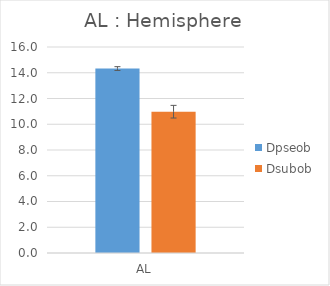
| Category | Dpseob | Dsubob |
|---|---|---|
| AL | 14.325 | 10.975 |